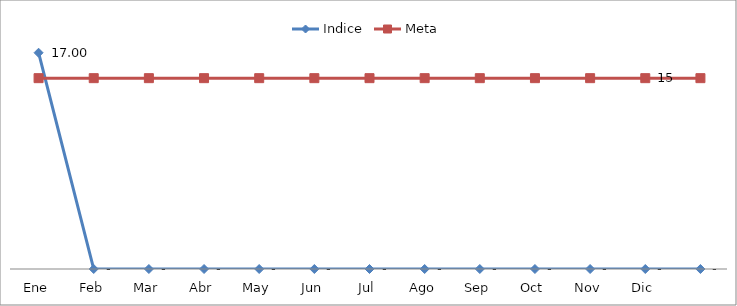
| Category | Indice | Meta |
|---|---|---|
| Ene | 17 | 15 |
| Feb | 0 | 15 |
| Mar | 0 | 15 |
| Abr | 0 | 15 |
| May | 0 | 15 |
| Jun | 0 | 15 |
| Jul | 0 | 15 |
| Ago | 0 | 15 |
| Sep | 0 | 15 |
| Oct | 0 | 15 |
| Nov | 0 | 15 |
| Dic | 0 | 15 |